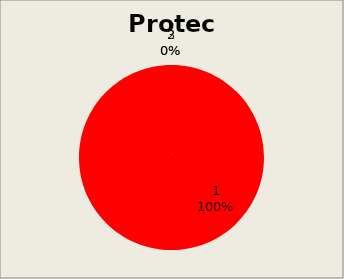
| Category | Series 1 |
|---|---|
| 0 | 80 |
| 1 | 0 |
| 2 | 0 |